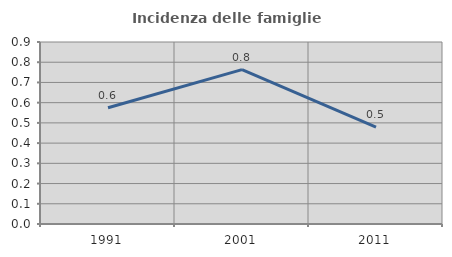
| Category | Incidenza delle famiglie numerose |
|---|---|
| 1991.0 | 0.575 |
| 2001.0 | 0.763 |
| 2011.0 | 0.48 |